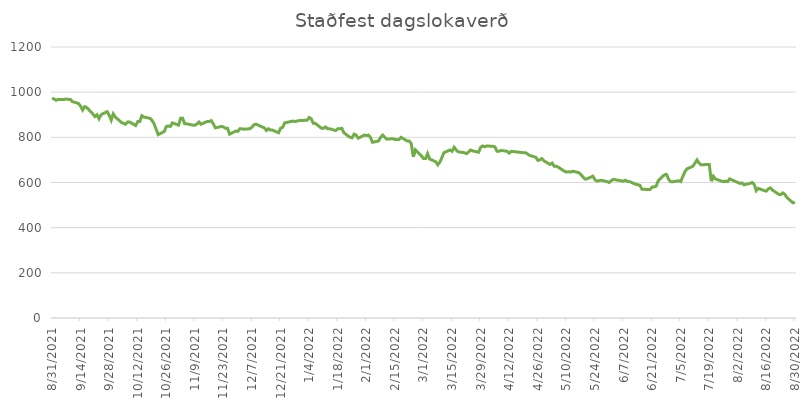
| Category | Staðfest dagslokaverð |
|---|---|
| 8/31/21 | 973 |
| 9/1/21 | 970 |
| 9/2/21 | 964 |
| 9/3/21 | 968 |
| 9/6/21 | 968 |
| 9/7/21 | 970 |
| 9/8/21 | 968 |
| 9/9/21 | 968 |
| 9/10/21 | 958 |
| 9/13/21 | 950 |
| 9/14/21 | 938 |
| 9/15/21 | 921 |
| 9/16/21 | 936 |
| 9/17/21 | 932 |
| 9/20/21 | 904 |
| 9/21/21 | 892 |
| 9/22/21 | 900 |
| 9/23/21 | 882 |
| 9/24/21 | 900 |
| 9/27/21 | 914 |
| 9/28/21 | 898 |
| 9/29/21 | 876 |
| 9/30/21 | 904 |
| 10/1/21 | 890 |
| 10/4/21 | 866 |
| 10/5/21 | 862 |
| 10/6/21 | 858 |
| 10/7/21 | 868 |
| 10/8/21 | 868 |
| 10/11/21 | 852 |
| 10/12/21 | 870 |
| 10/13/21 | 870 |
| 10/14/21 | 896 |
| 10/15/21 | 890 |
| 10/18/21 | 884 |
| 10/19/21 | 875 |
| 10/20/21 | 860 |
| 10/21/21 | 836 |
| 10/22/21 | 812 |
| 10/25/21 | 826 |
| 10/26/21 | 848 |
| 10/27/21 | 850 |
| 10/28/21 | 848 |
| 10/29/21 | 864 |
| 11/1/21 | 854 |
| 11/2/21 | 884 |
| 11/3/21 | 884 |
| 11/4/21 | 860 |
| 11/5/21 | 860 |
| 11/8/21 | 854 |
| 11/9/21 | 854 |
| 11/10/21 | 859 |
| 11/11/21 | 868 |
| 11/12/21 | 858 |
| 11/15/21 | 870 |
| 11/16/21 | 870 |
| 11/17/21 | 874 |
| 11/18/21 | 860 |
| 11/19/21 | 842 |
| 11/22/21 | 848 |
| 11/23/21 | 846 |
| 11/24/21 | 840 |
| 11/25/21 | 840 |
| 11/26/21 | 814 |
| 11/29/21 | 828 |
| 11/30/21 | 826 |
| 12/1/21 | 838 |
| 12/2/21 | 838 |
| 12/3/21 | 836 |
| 12/6/21 | 838 |
| 12/7/21 | 846 |
| 12/8/21 | 856 |
| 12/9/21 | 858 |
| 12/10/21 | 854 |
| 12/13/21 | 842 |
| 12/14/21 | 830 |
| 12/15/21 | 838 |
| 12/16/21 | 832 |
| 12/17/21 | 832 |
| 12/20/21 | 820 |
| 12/21/21 | 841 |
| 12/22/21 | 844 |
| 12/23/21 | 864 |
| 12/27/21 | 872 |
| 12/28/21 | 870 |
| 12/29/21 | 872 |
| 12/30/21 | 874 |
| 1/3/22 | 876 |
| 1/4/22 | 888 |
| 1/5/22 | 882 |
| 1/6/22 | 862 |
| 1/7/22 | 862 |
| 1/10/22 | 840 |
| 1/11/22 | 840 |
| 1/12/22 | 846 |
| 1/13/22 | 838 |
| 1/14/22 | 838 |
| 1/17/22 | 830 |
| 1/18/22 | 838 |
| 1/19/22 | 838 |
| 1/20/22 | 840 |
| 1/21/22 | 820 |
| 1/24/22 | 800 |
| 1/25/22 | 798 |
| 1/26/22 | 814 |
| 1/27/22 | 810 |
| 1/28/22 | 796 |
| 1/31/22 | 810 |
| 2/1/22 | 808 |
| 2/2/22 | 810 |
| 2/3/22 | 800 |
| 2/4/22 | 778 |
| 2/7/22 | 784 |
| 2/8/22 | 800 |
| 2/9/22 | 810 |
| 2/10/22 | 800 |
| 2/11/22 | 792 |
| 2/14/22 | 794 |
| 2/15/22 | 790 |
| 2/16/22 | 790 |
| 2/17/22 | 790 |
| 2/18/22 | 800 |
| 2/21/22 | 784 |
| 2/22/22 | 784 |
| 2/23/22 | 772 |
| 2/24/22 | 714 |
| 2/25/22 | 745 |
| 2/28/22 | 718 |
| 3/1/22 | 706 |
| 3/2/22 | 706 |
| 3/3/22 | 728 |
| 3/4/22 | 704 |
| 3/7/22 | 692 |
| 3/8/22 | 678 |
| 3/9/22 | 690 |
| 3/10/22 | 710 |
| 3/11/22 | 732 |
| 3/14/22 | 744 |
| 3/15/22 | 738 |
| 3/16/22 | 756 |
| 3/17/22 | 744 |
| 3/18/22 | 736 |
| 3/21/22 | 732 |
| 3/22/22 | 728 |
| 3/23/22 | 734 |
| 3/24/22 | 744 |
| 3/25/22 | 740 |
| 3/28/22 | 734 |
| 3/29/22 | 756 |
| 3/30/22 | 762 |
| 3/31/22 | 758 |
| 4/1/22 | 762 |
| 4/4/22 | 760 |
| 4/5/22 | 758 |
| 4/6/22 | 738 |
| 4/7/22 | 738 |
| 4/8/22 | 742 |
| 4/11/22 | 738 |
| 4/12/22 | 730 |
| 4/13/22 | 738 |
| 4/19/22 | 732 |
| 4/20/22 | 732 |
| 4/22/22 | 720 |
| 4/25/22 | 712 |
| 4/26/22 | 698 |
| 4/27/22 | 700 |
| 4/28/22 | 706 |
| 4/29/22 | 696 |
| 5/2/22 | 680 |
| 5/3/22 | 686 |
| 5/4/22 | 672 |
| 5/5/22 | 672 |
| 5/6/22 | 668 |
| 5/9/22 | 650 |
| 5/10/22 | 646 |
| 5/11/22 | 648 |
| 5/12/22 | 646 |
| 5/13/22 | 650 |
| 5/16/22 | 644 |
| 5/17/22 | 636 |
| 5/18/22 | 626 |
| 5/19/22 | 616 |
| 5/20/22 | 616 |
| 5/23/22 | 628 |
| 5/24/22 | 612 |
| 5/25/22 | 606 |
| 5/27/22 | 610 |
| 5/30/22 | 604 |
| 5/31/22 | 600 |
| 6/1/22 | 608 |
| 6/2/22 | 614 |
| 6/3/22 | 612 |
| 6/7/22 | 606 |
| 6/8/22 | 610 |
| 6/9/22 | 604 |
| 6/10/22 | 604 |
| 6/13/22 | 592 |
| 6/14/22 | 590 |
| 6/15/22 | 588 |
| 6/16/22 | 570 |
| 6/20/22 | 569 |
| 6/21/22 | 580 |
| 6/22/22 | 580 |
| 6/23/22 | 584 |
| 6/24/22 | 608 |
| 6/27/22 | 634 |
| 6/28/22 | 636 |
| 6/29/22 | 616 |
| 6/30/22 | 604 |
| 7/1/22 | 603 |
| 7/4/22 | 608 |
| 7/5/22 | 604 |
| 7/6/22 | 626 |
| 7/7/22 | 646 |
| 7/8/22 | 660 |
| 7/11/22 | 672 |
| 7/12/22 | 686 |
| 7/13/22 | 700 |
| 7/14/22 | 686 |
| 7/15/22 | 678 |
| 7/18/22 | 680 |
| 7/19/22 | 680 |
| 7/20/22 | 606 |
| 7/21/22 | 628 |
| 7/22/22 | 616 |
| 7/25/22 | 606 |
| 7/26/22 | 604 |
| 7/27/22 | 606 |
| 7/28/22 | 604 |
| 7/29/22 | 616 |
| 8/2/22 | 600 |
| 8/3/22 | 596 |
| 8/4/22 | 598 |
| 8/5/22 | 590 |
| 8/8/22 | 596 |
| 8/9/22 | 600 |
| 8/10/22 | 592 |
| 8/11/22 | 564 |
| 8/12/22 | 574 |
| 8/15/22 | 564 |
| 8/16/22 | 562 |
| 8/17/22 | 572 |
| 8/18/22 | 576 |
| 8/19/22 | 566 |
| 8/22/22 | 548 |
| 8/23/22 | 546 |
| 8/24/22 | 554 |
| 8/25/22 | 548 |
| 8/26/22 | 534 |
| 8/29/22 | 510 |
| 8/30/22 | 512 |